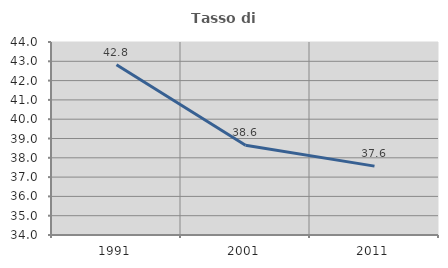
| Category | Tasso di occupazione   |
|---|---|
| 1991.0 | 42.823 |
| 2001.0 | 38.648 |
| 2011.0 | 37.57 |